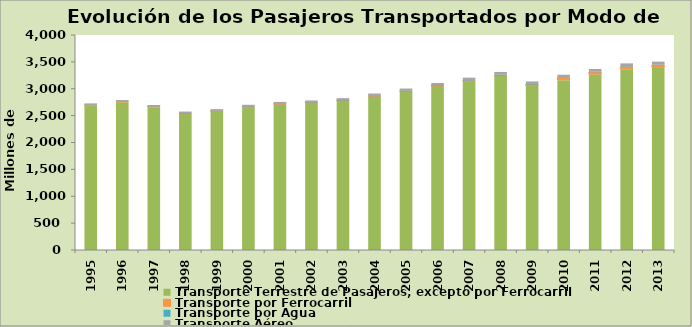
| Category | Transporte Terrestre de Pasajeros, excepto por Ferrocarril | Transporte por Ferrocarril | Transporte por Agua | Transporte Aéreo |
|---|---|---|---|---|
| 1995.0 | 2691 | 6.678 | 5.098 | 25.192 |
| 1996.0 | 2750 | 6.727 | 6.394 | 26.493 |
| 1997.0 | 2658 | 5.092 | 6.228 | 28.896 |
| 1998.0 | 2536 | 1.576 | 7.179 | 30.922 |
| 1999.0 | 2580 | 0.801 | 7.854 | 32.662 |
| 2000.0 | 2660 | 0.334 | 7.4 | 33.974 |
| 2001.0 | 2713 | 0.242 | 7.507 | 33.673 |
| 2002.0 | 2740 | 0.237 | 8.715 | 33.19 |
| 2003.0 | 2780 | 0.27 | 9.843 | 35.287 |
| 2004.0 | 2860 | 0.253 | 11.744 | 39.422 |
| 2005.0 | 2950 | 0.253 | 11.461 | 42.176 |
| 2006.0 | 3050 | 0.26 | 11.985 | 45.406 |
| 2007.0 | 3141 | 0.288 | 12.761 | 52.217 |
| 2008.0 | 3238 | 8.915 | 12.597 | 53.3 |
| 2009.0 | 3050 | 28 | 10.985 | 46.971 |
| 2010.0 | 3160 | 40.398 | 11.793 | 48.698 |
| 2011.0 | 3264.3 | 41.922 | 10.814 | 50.764 |
| 2012.0 | 3363 | 43.83 | 10.266 | 55.153 |
| 2013.0 | 3391 | 45.3 | 10.014 | 58.031 |